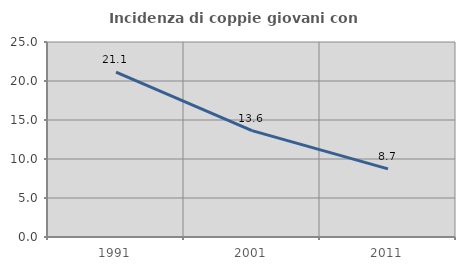
| Category | Incidenza di coppie giovani con figli |
|---|---|
| 1991.0 | 21.124 |
| 2001.0 | 13.644 |
| 2011.0 | 8.736 |